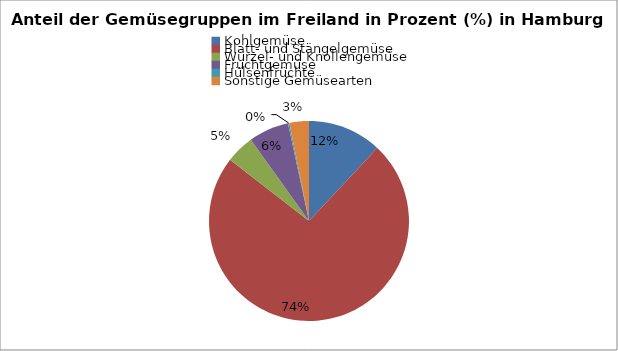
| Category | Series 0 |
|---|---|
| Kohlgemüse  | 53.2 |
| Blatt- und Stängelgemüse | 327.4 |
| Wurzel- und Knollengemüse | 20.5 |
| Fruchtgemüse | 29 |
| Hülsenfrüchte | 1 |
| Sonstige Gemüsearten | 14 |